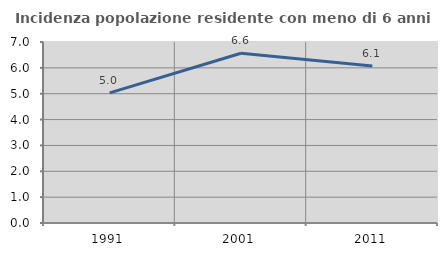
| Category | Incidenza popolazione residente con meno di 6 anni |
|---|---|
| 1991.0 | 5.034 |
| 2001.0 | 6.564 |
| 2011.0 | 6.073 |